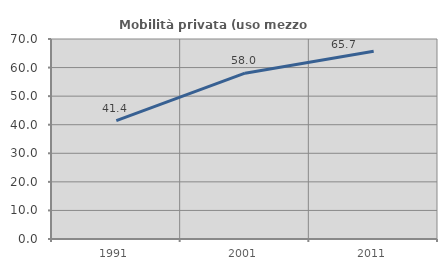
| Category | Mobilità privata (uso mezzo privato) |
|---|---|
| 1991.0 | 41.409 |
| 2001.0 | 58.035 |
| 2011.0 | 65.692 |